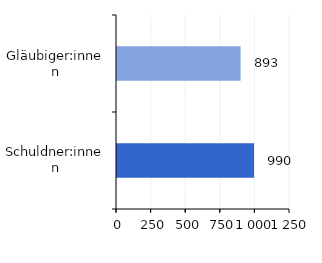
| Category | Series 0 |
|---|---|
| Gläubiger:innen | 893 |
| Schuldner:innen | 990 |